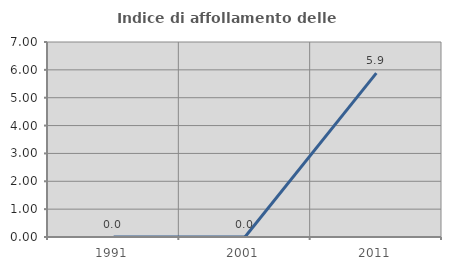
| Category | Indice di affollamento delle abitazioni  |
|---|---|
| 1991.0 | 0 |
| 2001.0 | 0 |
| 2011.0 | 5.882 |